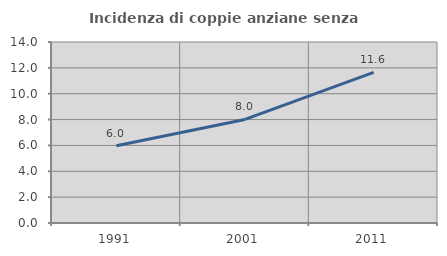
| Category | Incidenza di coppie anziane senza figli  |
|---|---|
| 1991.0 | 5.976 |
| 2001.0 | 8.013 |
| 2011.0 | 11.648 |